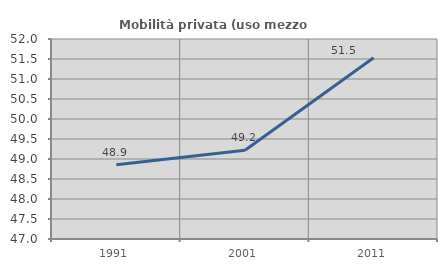
| Category | Mobilità privata (uso mezzo privato) |
|---|---|
| 1991.0 | 48.859 |
| 2001.0 | 49.218 |
| 2011.0 | 51.53 |